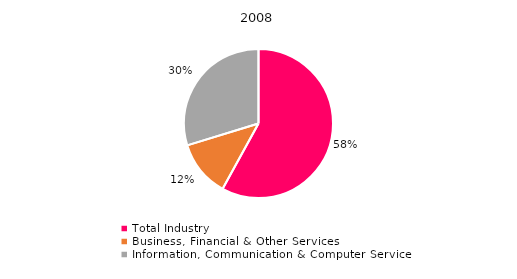
| Category | Series 0 |
|---|---|
| Total Industry | 90886 |
| Business, Financial & Other Services | 19223 |
| Information, Communication & Computer Services | 46609 |